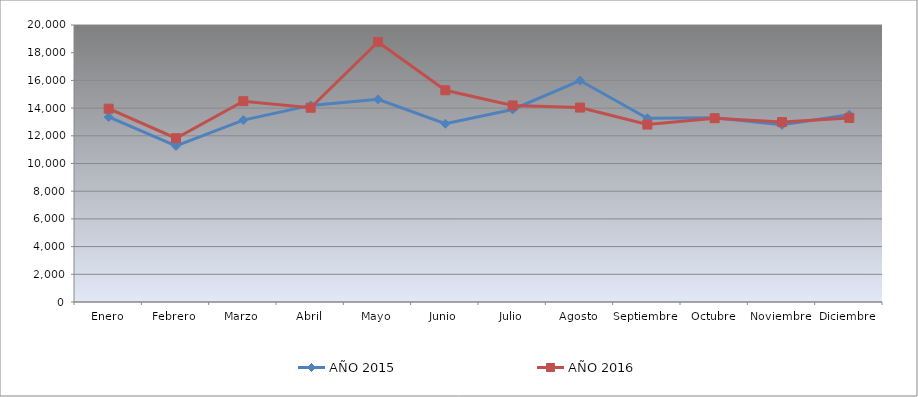
| Category | AÑO 2015 | AÑO 2016 |
|---|---|---|
| Enero | 13359.114 | 13957.392 |
| Febrero | 11266.426 | 11825.563 |
| Marzo | 13135.344 | 14500.357 |
| Abril | 14195.855 | 14026.381 |
| Mayo | 14635.061 | 18778.921 |
| Junio | 12871.153 | 15286.911 |
| Julio | 13898.745 | 14192.038 |
| Agosto | 15989.349 | 14038.305 |
| Septiembre | 13270.356 | 12810.565 |
| Octubre | 13305.776 | 13269.637 |
| Noviembre | 12790.729 | 12990.702 |
| Diciembre | 13524.129 | 13291.355 |